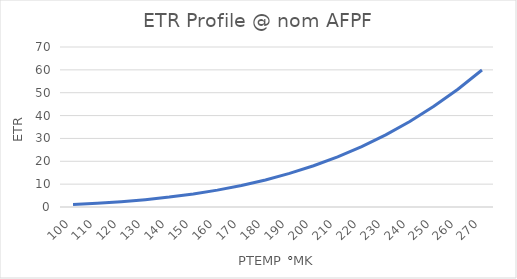
| Category | Series 0 |
|---|---|
| 100.0 | 1.128 |
| 110.0 | 1.651 |
| 120.0 | 2.338 |
| 130.0 | 3.22 |
| 140.0 | 4.331 |
| 150.0 | 5.708 |
| 160.0 | 7.389 |
| 170.0 | 9.417 |
| 180.0 | 11.836 |
| 190.0 | 14.694 |
| 200.0 | 18.04 |
| 210.0 | 21.928 |
| 220.0 | 26.412 |
| 230.0 | 31.552 |
| 240.0 | 37.408 |
| 250.0 | 44.043 |
| 260.0 | 51.524 |
| 270.0 | 59.92 |